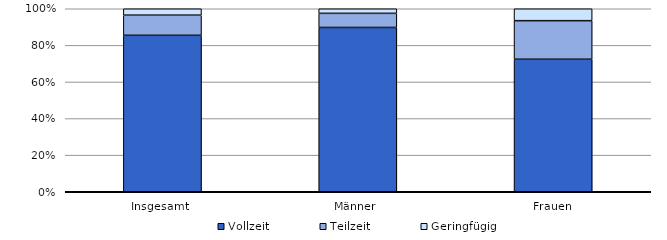
| Category | Vollzeit | Teilzeit | Geringfügig |
|---|---|---|---|
| Insgesamt  | 85.495 | 11.008 | 3.496 |
| Männer  | 89.789 | 7.706 | 2.506 |
| Frauen | 72.416 | 21.07 | 6.514 |